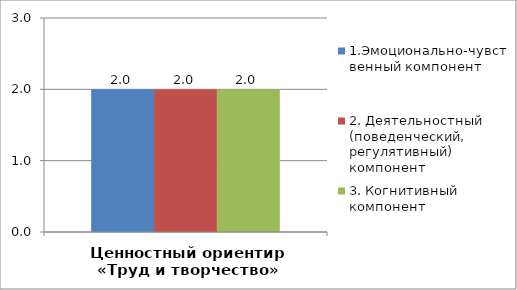
| Category | 1.Эмоционально-чувственный компонент | 2. Деятельностный (поведенческий, регулятивный) компонент | 3. Когнитивный компонент |
|---|---|---|---|
| Ценностный ориентир «Труд и творчество» | 2 | 2 | 2 |